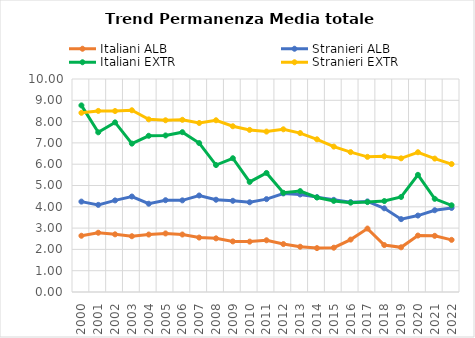
| Category | Italiani ALB | Stranieri ALB | Italiani EXTR | Stranieri EXTR |
|---|---|---|---|---|
| 2000.0 | 2.64 | 4.244 | 8.76 | 8.412 |
| 2001.0 | 2.782 | 4.091 | 7.496 | 8.502 |
| 2002.0 | 2.707 | 4.3 | 7.963 | 8.496 |
| 2003.0 | 2.619 | 4.482 | 6.966 | 8.533 |
| 2004.0 | 2.697 | 4.144 | 7.334 | 8.105 |
| 2005.0 | 2.749 | 4.31 | 7.349 | 8.062 |
| 2006.0 | 2.699 | 4.303 | 7.503 | 8.084 |
| 2007.0 | 2.556 | 4.53 | 6.992 | 7.936 |
| 2008.0 | 2.519 | 4.332 | 5.96 | 8.062 |
| 2009.0 | 2.375 | 4.282 | 6.28 | 7.782 |
| 2010.0 | 2.365 | 4.212 | 5.167 | 7.61 |
| 2011.0 | 2.428 | 4.361 | 5.589 | 7.531 |
| 2012.0 | 2.25 | 4.626 | 4.657 | 7.638 |
| 2013.0 | 2.125 | 4.579 | 4.737 | 7.462 |
| 2014.0 | 2.061 | 4.454 | 4.436 | 7.169 |
| 2015.0 | 2.08 | 4.327 | 4.277 | 6.826 |
| 2016.0 | 2.461 | 4.218 | 4.196 | 6.565 |
| 2017.0 | 2.978 | 4.252 | 4.221 | 6.345 |
| 2018.0 | 2.203 | 3.93 | 4.27 | 6.369 |
| 2019.0 | 2.098 | 3.42 | 4.461 | 6.275 |
| 2020.0 | 2.65 | 3.589 | 5.5 | 6.561 |
| 2021.0 | 2.637 | 3.838 | 4.374 | 6.263 |
| 2022.0 | 2.448 | 3.947 | 4.071 | 6.007 |